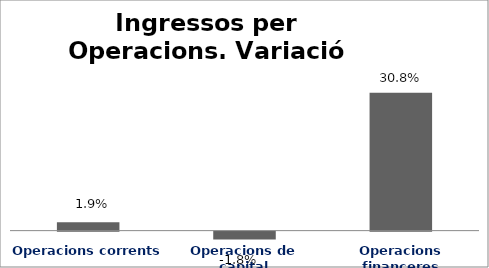
| Category | Series 0 |
|---|---|
| Operacions corrents | 0.019 |
| Operacions de capital | -0.018 |
| Operacions financeres | 0.308 |